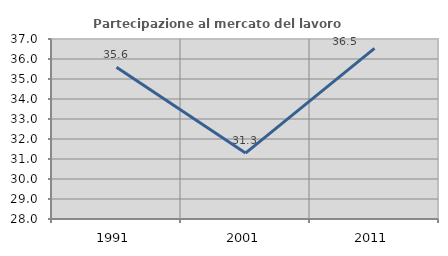
| Category | Partecipazione al mercato del lavoro  femminile |
|---|---|
| 1991.0 | 35.593 |
| 2001.0 | 31.298 |
| 2011.0 | 36.531 |